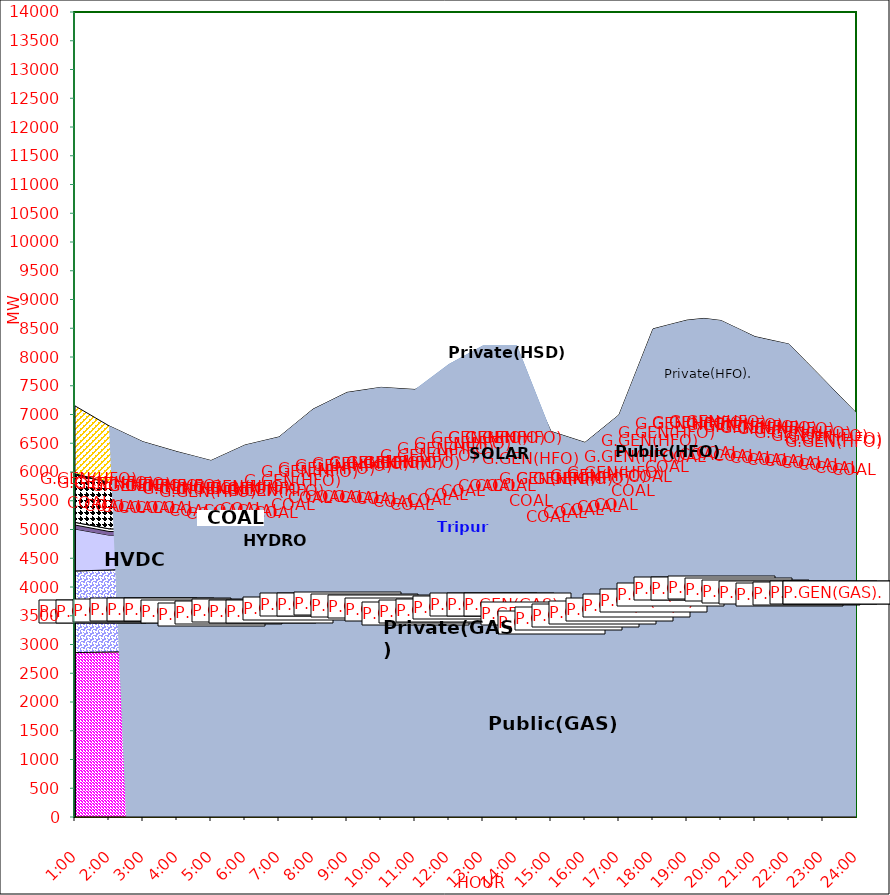
| Category | GAS | P.GEN(GAS). |  HVDC | TRIPURA | HYDRO | COAL | SOLAR | G.GEN(HFO) | P.GEN(HFO). | G.GEN(HSD) | P.GEN(HSD) | SHORTAGE | Total Energy Gen 180.201 MKWHr 
Energy Not Served   0.000 MKWHr 
Energy Requirement     180.201 MKWHr  |
|---|---|---|---|---|---|---|---|---|---|---|---|---|---|
| 1:00 | 2859 | 1420 | 729 | 70 | 46 | 827 | 0 | 18 | 1181 | 0 | 0 | 0 |  |
| 1:30 | 2864.5 | 1422.5 | 668 | 67 | 46 | 817 | 0 | 9 | 1082.5 | 0 | 0 | 0 |  |
| 2:00 | 2870 | 1425 | 607 | 64 | 46 | 807 | 0 | 0 | 984 | 0 | 0 | 0 |  |
| 2:30 | 2874 | 1435.5 | 585 | 65 | 46 | 787.5 | 0 | 0 | 871.5 | 0 | 0 | 0 |  |
| 3:00 | 2878 | 1446 | 563 | 66 | 46 | 768 | 0 | 0 | 759 | 0 | 0 | 0 |  |
| 3:30 | 2888.5 | 1439.5 | 563 | 65 | 46 | 767 | 0 | 0 | 671 | 0 | 0 | 0 |  |
| 4:00 | 2899 | 1433 | 563 | 64 | 46 | 766 | 0 | 0 | 583 | 0 | 0 | 0 |  |
| 4:30 | 2859 | 1420 | 563.5 | 64 | 46 | 766.5 | 0 | 0 | 557.5 | 0 | 0 | 0 |  |
| 5:00 | 2819 | 1407 | 564 | 64 | 46 | 767 | 0 | 0 | 532 | 0 | 0 | 0 |  |
| 5:30 | 2846 | 1416 | 563.5 | 69 | 46 | 768 | 0 | 0 | 625.5 | 0 | 0 | 0 |  |
| 6:00 | 2873 | 1425 | 563 | 74 | 46 | 769 | 0 | 0 | 719 | 0 | 0 | 0 |  |
| 6:30 | 2879 | 1394.5 | 563 | 73 | 46 | 758 | 2 | 0 | 823.5 | 0 | 0 | 0 |  |
| 7:00 | 2885 | 1364 | 563 | 72 | 46 | 747 | 4 | 0 | 928 | 0 | 0 | 0 |  |
| 7:30 | 2902.5 | 1462 | 563.5 | 71 | 46 | 768 | 21.5 | 21 | 995.5 | 0 | 0 | 0 |  |
| 8:00 | 2920 | 1560 | 564 | 70 | 46 | 789 | 39 | 42 | 1063 | 0 | 0 | 0 |  |
| 8:30 | 2929.5 | 1545.5 | 563.5 | 75 | 46 | 818 | 61 | 47 | 1153 | 0 | 0 | 0 |  |
| 9:00 | 2939 | 1531 | 563 | 80 | 46 | 847 | 83 | 52 | 1243 | 0 | 0 | 0 |  |
| 9:30 | 2939.5 | 1489.5 | 563 | 81 | 46 | 882 | 111 | 56 | 1260 | 0 | 0 | 0 |  |
| 10:00 | 2940 | 1448 | 563 | 82 | 46 | 917 | 139 | 60 | 1277 | 0 | 0 | 0 |  |
| 10:30 | 2875.5 | 1460 | 563 | 80 | 46 | 921.5 | 189.5 | 64 | 1254 | 0 | 0 | 0 |  |
| 11:00 | 2811 | 1472 | 563 | 78 | 46 | 926 | 240 | 68 | 1231 | 0 | 0 | 0 |  |
| 11:30 | 2837.5 | 1462 | 622.5 | 81 | 46 | 937.5 | 264.5 | 70 | 1251.5 | 0 | 85 | 0 |  |
| 12:00 | 2864 | 1452 | 682 | 84 | 46 | 949 | 289 | 72 | 1272 | 0 | 170 | 0 |  |
| 12:30 | 2913 | 1460.5 | 682 | 94 | 46 | 978 | 288.5 | 72 | 1312 | 0 | 195 | 0 |  |
| 13:00 | 2962 | 1469 | 682 | 104 | 46 | 1007 | 288 | 72 | 1352 | 0 | 220 | 0 |  |
| 13:30 | 2962 | 1469 | 682 | 104 | 46 | 1007 | 288 | 72 | 1352 | 0 | 220 | 0 |  |
| 14:00 | 2962 | 1469 | 682 | 104 | 46 | 1007 | 288 | 72 | 1352 | 0 | 220 | 0 |  |
| 14:30 | 2882 | 1321 | 669.5 | 95 | 46 | 973 | 225 | 56 | 1076.5 | 0 | 110 | 0 |  |
| 15:00 | 2802 | 1173 | 657 | 86 | 46 | 939 | 162 | 40 | 801 | 0 | 0 | 0 |  |
| 15:30 | 2849.5 | 1199.5 | 657 | 85 | 41.5 | 920 | 115.5 | 40 | 702 | 0 | 0 | 0 |  |
| 16:00 | 2897 | 1226 | 657 | 84 | 37 | 901 | 69 | 40 | 603 | 0 | 0 | 0 |  |
| 16:30 | 2942 | 1227.5 | 657 | 85 | 33.5 | 900 | 39.5 | 111.5 | 758 | 0 | 0 | 0 |  |
| 17:00 | 2987 | 1229 | 657 | 86 | 30 | 899 | 10 | 183 | 913 | 0 | 0 | 0 |  |
| 17:30 | 3025.5 | 1316 | 764 | 94 | 35 | 895 | 5 | 275.5 | 1331.5 | 0 | 0 | 0 |  |
| 18:00 | 3064 | 1403 | 871 | 102 | 40 | 891 | 0 | 368 | 1750 | 0 | 0 | 0 |  |
| 18:30 | 3126.5 | 1488.5 | 871 | 102 | 35 | 955.5 | 0 | 233 | 1753.5 | 0 | 0 | 0 |  |
| 19:00 | 3189 | 1574 | 871 | 102 | 30 | 1020 | 0 | 98 | 1757 | 0 | 0 | 0 |  |
| 19:30 | 3201 | 1561 | 871 | 100 | 30 | 1079 | 0 | 51 | 1778 | 0 | 0 | 0 |  |
| 20:00 | 3208 | 1575 | 871 | 102 | 30 | 1092 | 0 | 0 | 1756 | 0 | 0 | 0 |  |
| 20:30 | 3169.5 | 1574 | 871.5 | 99 | 30 | 1090.5 | 0 | 0 | 1659.5 | 0 | 0 | 0 |  |
| 21:00 | 3131 | 1573 | 872 | 96 | 30 | 1089 | 0 | 0 | 1563 | 0 | 0 | 0 |  |
| 21:30 | 3115.5 | 1561 | 871 | 94 | 38 | 1090 | 0 | 0 | 1519.5 | 0 | 0 | 0 |  |
| 22:00 | 3100 | 1549 | 870 | 92 | 46 | 1091 | 0 | 0 | 1476 | 0 | 0 | 0 |  |
| 22:30 | 3109.5 | 1561 | 823 | 94 | 46 | 1060 | 0 | 0 | 1229.5 | 0 | 0 | 0 |  |
| 23:00 | 3119 | 1573 | 776 | 96 | 46 | 1029 | 0 | 0 | 983 | 0 | 0 | 0 |  |
| 23:30 | 3119.5 | 1574.5 | 752.5 | 89 | 46 | 1000 | 0 | 0 | 737 | 0 | 0 | 0 |  |
| 24:00 | 3120 | 1576 | 729 | 82 | 46 | 971 | 0 | 0 | 491 | 0 | 0 | 0 |  |